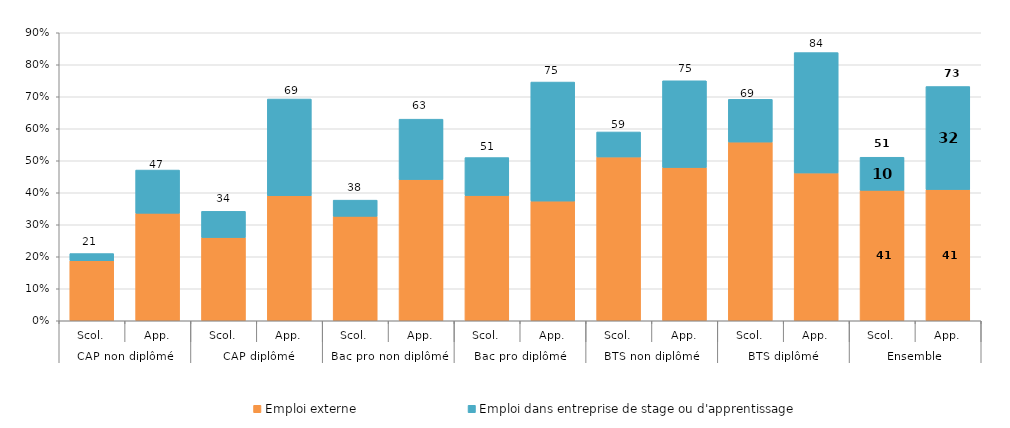
| Category | Emploi externe | Emploi dans entreprise de stage ou d'apprentissage |
|---|---|---|
| 0 | 18.746 | 2.254 |
| 1 | 33.599 | 13.501 |
| 2 | 26.008 | 8.192 |
| 3 | 39.064 | 30.236 |
| 4 | 32.633 | 5.067 |
| 5 | 44.13 | 18.87 |
| 6 | 39.137 | 11.863 |
| 7 | 37.402 | 37.198 |
| 8 | 51.194 | 7.806 |
| 9 | 47.911 | 27.089 |
| 10 | 55.846 | 13.354 |
| 11 | 46.192 | 37.608 |
| 12 | 40.758 | 10.342 |
| 13 | 41.016 | 32.184 |